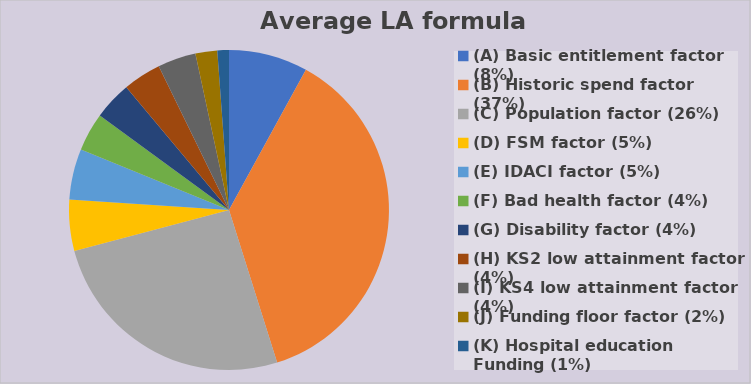
| Category | Series 0 |
|---|---|
| (A) Basic entitlement factor (8%) | 0.08 |
| (B) Historic spend factor (37%) | 0.372 |
| (C) Population factor (26%) | 0.257 |
| (D) FSM factor (5%) | 0.051 |
| (E) IDACI factor (5%) | 0.051 |
| (F) Bad health factor (4%) | 0.039 |
| (G) Disability factor (4%) | 0.039 |
| (H) KS2 low attainment factor (4%) | 0.039 |
| (I) KS4 low attainment factor (4%) | 0.039 |
| (J) Funding floor factor (2%) | 0.022 |
| (K) Hospital education Funding (1%) | 0.012 |